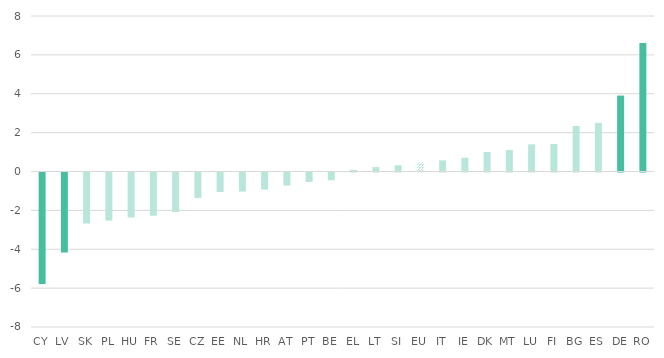
| Category | Change in underachievers in mathematics, 2015-2018 |
|---|---|
| 0 | -5.739 |
| 1 | -4.116 |
| 2 | -2.625 |
| 3 | -2.474 |
| 4 | -2.314 |
| 5 | -2.222 |
| 6 | -2.03 |
| 7 | -1.306 |
| 8 | -1.001 |
| 9 | -0.981 |
| 10 | -0.878 |
| 11 | -0.673 |
| 12 | -0.484 |
| 13 | -0.401 |
| 14 | 0.082 |
| 15 | 0.227 |
| 16 | 0.32 |
| 17 | 0.472 |
| 18 | 0.572 |
| 19 | 0.71 |
| 20 | 0.999 |
| 21 | 1.11 |
| 22 | 1.398 |
| 23 | 1.412 |
| 24 | 2.339 |
| 25 | 2.5 |
| 26 | 3.906 |
| 27 | 6.605 |